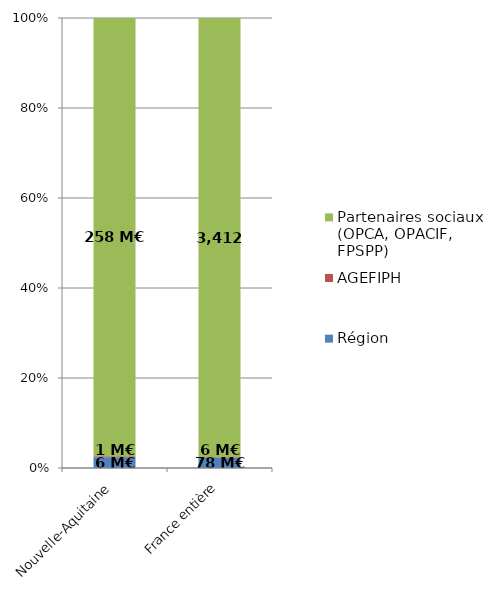
| Category | Région | AGEFIPH | Partenaires sociaux (OPCA, OPACIF, FPSPP) |
|---|---|---|---|
| Nouvelle-Aquitaine | 6.309 | 0.599 | 257.617 |
| France entière | 77.612 | 6.161 | 3411.683 |